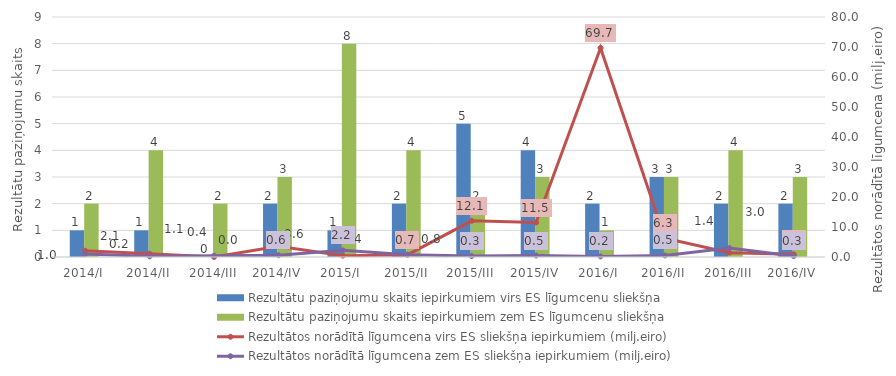
| Category | Rezultātu paziņojumu skaits iepirkumiem virs ES līgumcenu sliekšņa | Rezultātu paziņojumu skaits iepirkumiem zem ES līgumcenu sliekšņa |
|---|---|---|
| 2014/I | 1 | 2 |
| 2014/II | 1 | 4 |
| 2014/III | 0 | 2 |
| 2014/IV | 2 | 3 |
| 2015/I | 1 | 8 |
| 2015/II | 2 | 4 |
| 2015/III | 5 | 2 |
| 2015/IV | 4 | 3 |
| 2016/I | 2 | 1 |
| 2016/II | 3 | 3 |
| 2016/III | 2 | 4 |
| 2016/IV | 2 | 3 |